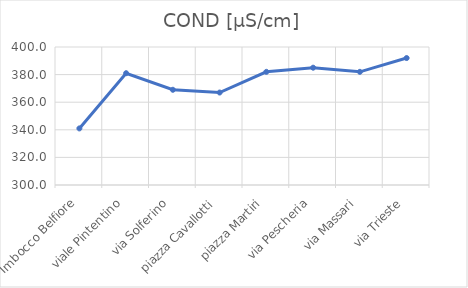
| Category | COND [µS/cm] |
|---|---|
| Imbocco Belfiore | 341 |
| viale Pintentino | 381 |
| via Solferino | 369 |
| piazza Cavallotti | 367 |
| piazza Martiri | 382 |
| via Pescheria | 385 |
| via Massari | 382 |
| via Trieste | 392 |